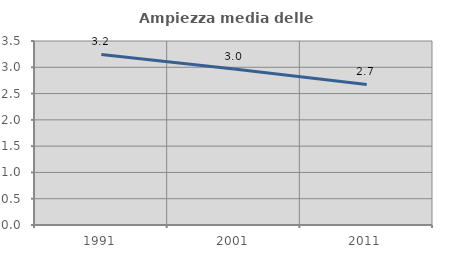
| Category | Ampiezza media delle famiglie |
|---|---|
| 1991.0 | 3.243 |
| 2001.0 | 2.966 |
| 2011.0 | 2.673 |